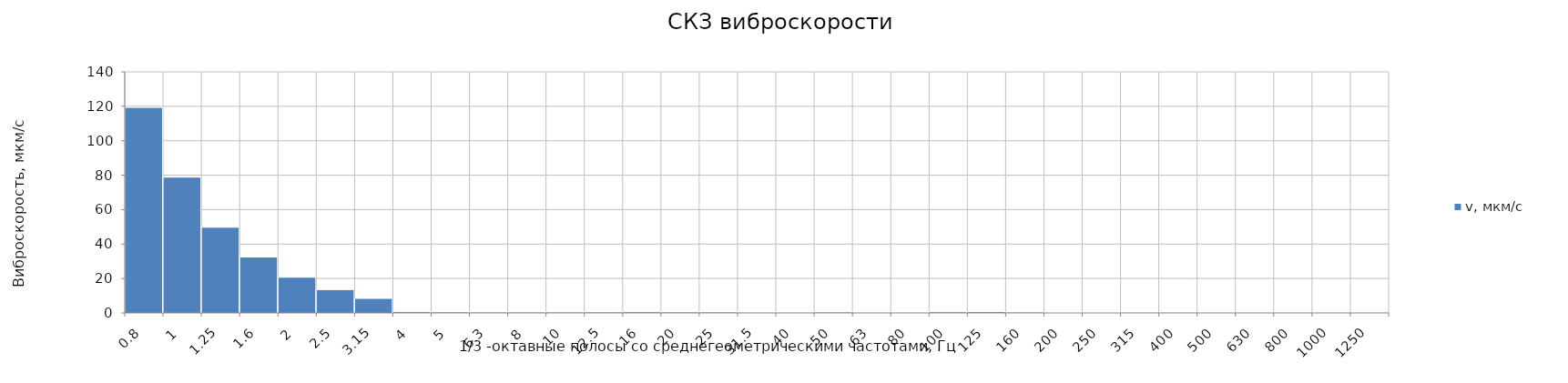
| Category | v, мкм/c |
|---|---|
| 0.8 | 119.357 |
| 1.0 | 78.856 |
| 1.25 | 49.756 |
| 1.6 | 32.496 |
| 2.0 | 20.741 |
| 2.5 | 13.547 |
| 3.15 | 8.449 |
| 4.0 | 0.736 |
| 5.0 | 0.578 |
| 6.3 | 0.486 |
| 8.0 | 0.492 |
| 10.0 | 0.498 |
| 12.5 | 0.558 |
| 16.0 | 0.648 |
| 20.0 | 0.552 |
| 25.0 | 0.546 |
| 31.5 | 0.386 |
| 40.0 | 0.348 |
| 50.0 | 0.521 |
| 63.0 | 0.115 |
| 80.0 | 0.106 |
| 100.0 | 0.619 |
| 125.0 | 0.771 |
| 160.0 | 0.481 |
| 200.0 | 0.258 |
| 250.0 | 0.255 |
| 315.0 | 0.106 |
| 400.0 | 0.069 |
| 500.0 | 0.056 |
| 630.0 | 0.05 |
| 800.0 | 0.038 |
| 1000.0 | 0.03 |
| 1250.0 | 0.025 |